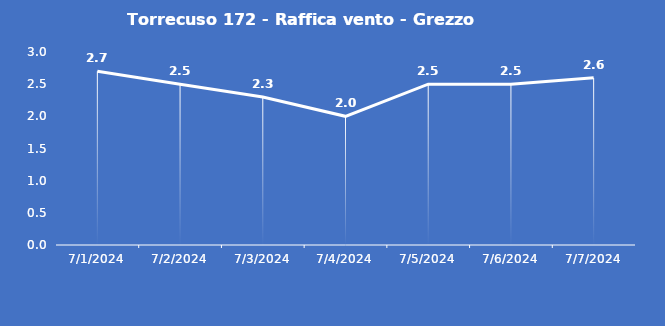
| Category | Torrecuso 172 - Raffica vento - Grezzo (m/s) |
|---|---|
| 7/1/24 | 2.7 |
| 7/2/24 | 2.5 |
| 7/3/24 | 2.3 |
| 7/4/24 | 2 |
| 7/5/24 | 2.5 |
| 7/6/24 | 2.5 |
| 7/7/24 | 2.6 |